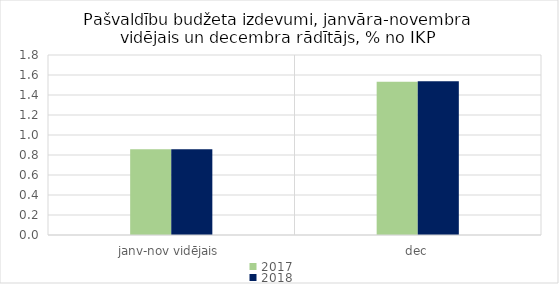
| Category | 2017 | 2018 |
|---|---|---|
| janv-nov vidējais | 0.858 | 0.859 |
| dec | 1.532 | 1.538 |